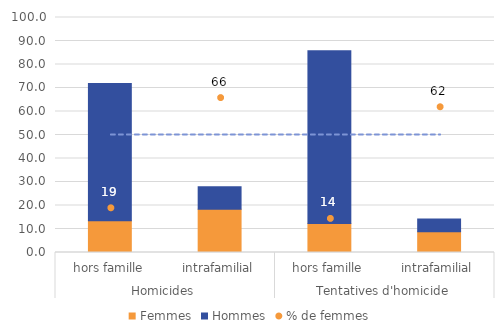
| Category | Femmes | Hommes |
|---|---|---|
| 0 | 13.5 | 58.4 |
| 1 | 18.4 | 9.6 |
| 2 | 12.3 | 73.5 |
| 3 | 8.8 | 5.5 |